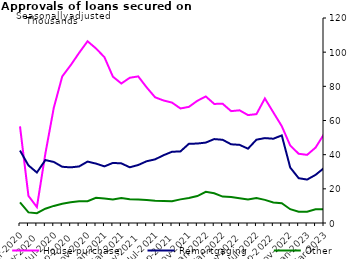
| Category | House purchase | Remortgaging | Other |
|---|---|---|---|
| Mar-2020 | 56555 | 42411 | 12045 |
| Apr-2020 | 15870 | 33719 | 6210 |
| May-2020 | 9333 | 29554 | 5759 |
| Jun-2020 | 40495 | 36830 | 8366 |
| Jul-2020 | 67396 | 35743 | 9996 |
| Aug-2020 | 85756 | 32920 | 11308 |
| Sep-2020 | 92346 | 32565 | 12203 |
| Oct-2020 | 99593 | 33109 | 12799 |
| Nov-2020 | 106384 | 35951 | 12786 |
| Dec-2020 | 102175 | 34765 | 14731 |
| Jan-2021 | 97055 | 33156 | 14281 |
| Feb-2021 | 85669 | 35170 | 13776 |
| Mar-2021 | 81651 | 34905 | 14608 |
| Apr-2021 | 85019 | 32609 | 13954 |
| May-2021 | 85813 | 33953 | 13753 |
| Jun-2021 | 79369 | 36156 | 13474 |
| Jul-2021 | 73583 | 37254 | 13079 |
| Aug-2021 | 71705 | 39678 | 12916 |
| Sep-2021 | 70475 | 41695 | 12782 |
| Oct-2021 | 67047 | 41904 | 13824 |
| Nov-2021 | 67976 | 46352 | 14681 |
| Dec-2021 | 71528 | 46512 | 15766 |
| Jan-2022 | 74078 | 47071 | 18240 |
| Feb-2022 | 69716 | 49125 | 17396 |
| Mar-2022 | 69777 | 48699 | 15476 |
| Apr-2022 | 65481 | 46077 | 15166 |
| May-2022 | 65965 | 45746 | 14551 |
| Jun-2022 | 63168 | 43498 | 13696 |
| Jul-2022 | 63723 | 48764 | 14570 |
| Aug-2022 | 72898 | 49701 | 13529 |
| Sep-2022 | 64743 | 49326 | 12039 |
| Oct-2022 | 56690 | 51267 | 11557 |
| Nov-2022 | 45346 | 32461 | 8081 |
| Dec-2022 | 40528 | 26234 | 6616 |
| Jan-2023 | 39886 | 25414 | 6631 |
| Feb-2023 | 44126 | 28176 | 7992 |
| Mar-2023 | 52011 | 32177 | 8119 |